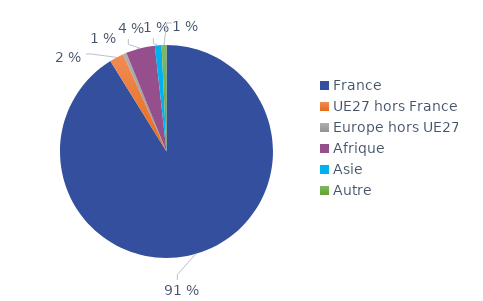
| Category | Series 0 |
|---|---|
| France | 0.912 |
| UE27 hors France | 0.022 |
| Europe hors UE27 | 0.005 |
| Afrique | 0.044 |
| Asie | 0.01 |
| Autre | 0.007 |